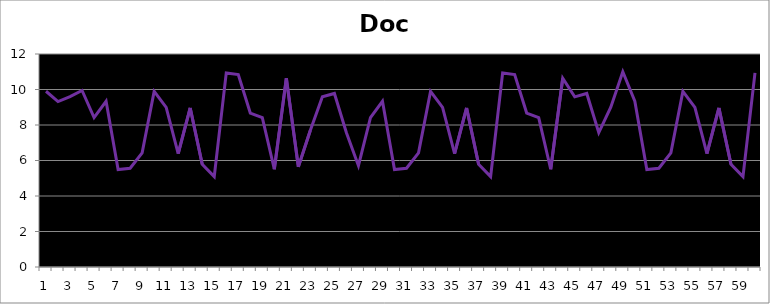
| Category | Doc |
|---|---|
| 0 | 9.902 |
| 1 | 9.322 |
| 2 | 9.6 |
| 3 | 9.944 |
| 4 | 8.417 |
| 5 | 9.337 |
| 6 | 5.489 |
| 7 | 5.565 |
| 8 | 6.432 |
| 9 | 9.893 |
| 10 | 8.993 |
| 11 | 6.393 |
| 12 | 8.961 |
| 13 | 5.791 |
| 14 | 5.09 |
| 15 | 10.935 |
| 16 | 10.843 |
| 17 | 8.674 |
| 18 | 8.41 |
| 19 | 5.507 |
| 20 | 10.637 |
| 21 | 5.641 |
| 22 | 7.706 |
| 23 | 9.586 |
| 24 | 9.777 |
| 25 | 7.569 |
| 26 | 5.705 |
| 27 | 8.417 |
| 28 | 9.337 |
| 29 | 5.489 |
| 30 | 5.565 |
| 31 | 6.432 |
| 32 | 9.893 |
| 33 | 8.993 |
| 34 | 6.393 |
| 35 | 8.961 |
| 36 | 5.791 |
| 37 | 5.09 |
| 38 | 10.935 |
| 39 | 10.843 |
| 40 | 8.674 |
| 41 | 8.41 |
| 42 | 5.507 |
| 43 | 10.637 |
| 44 | 9.586 |
| 45 | 9.777 |
| 46 | 7.569 |
| 47 | 9 |
| 48 | 11 |
| 49 | 9.337 |
| 50 | 5.489 |
| 51 | 5.565 |
| 52 | 6.432 |
| 53 | 9.893 |
| 54 | 8.993 |
| 55 | 6.393 |
| 56 | 8.961 |
| 57 | 5.791 |
| 58 | 5.09 |
| 59 | 10.935 |